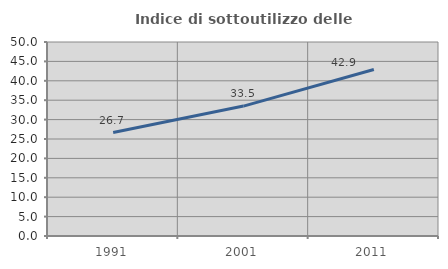
| Category | Indice di sottoutilizzo delle abitazioni  |
|---|---|
| 1991.0 | 26.667 |
| 2001.0 | 33.484 |
| 2011.0 | 42.904 |